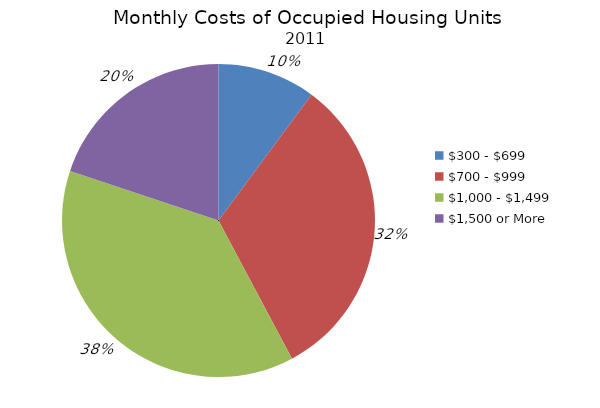
| Category | Series 0 |
|---|---|
| $300 - $699 | 0.101 |
| $700 - $999 | 0.321 |
| $1,000 - $1,499 | 0.379 |
| $1,500 or More | 0.199 |